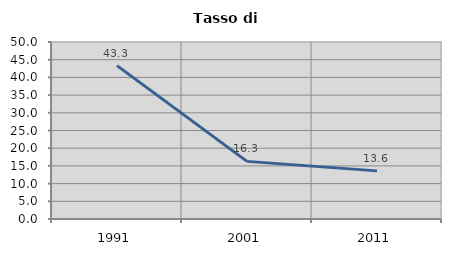
| Category | Tasso di disoccupazione   |
|---|---|
| 1991.0 | 43.333 |
| 2001.0 | 16.279 |
| 2011.0 | 13.594 |